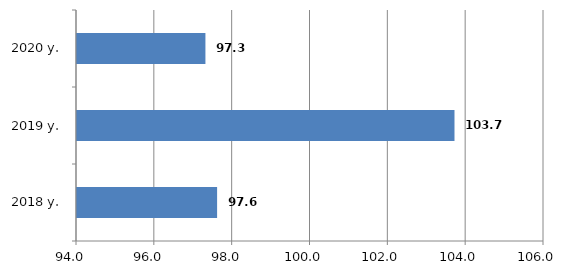
| Category | Series 0 |
|---|---|
| 2018 y. | 97.6 |
| 2019 y. | 103.7 |
| 2020 y. | 97.3 |